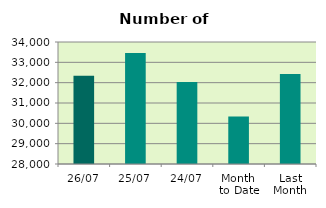
| Category | Series 0 |
|---|---|
| 26/07 | 32346 |
| 25/07 | 33464 |
| 24/07 | 32032 |
| Month 
to Date | 30339.6 |
| Last
Month | 32421.5 |